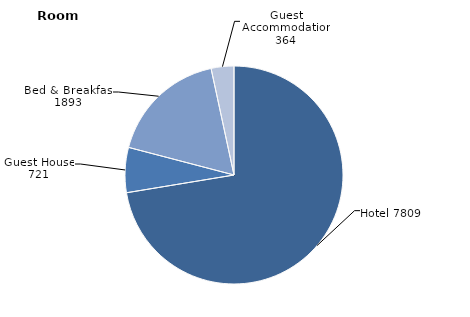
| Category | Series 0 |
|---|---|
| Hotel | 7809 |
| Guest House | 721 |
| Bed & Breakfast | 1893 |
| Guest Accommodation | 364 |